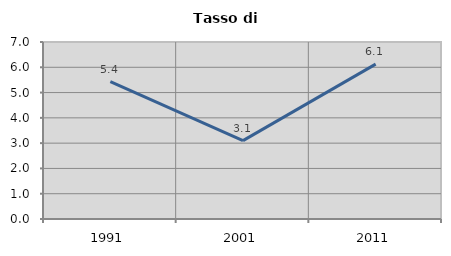
| Category | Tasso di disoccupazione   |
|---|---|
| 1991.0 | 5.431 |
| 2001.0 | 3.102 |
| 2011.0 | 6.123 |